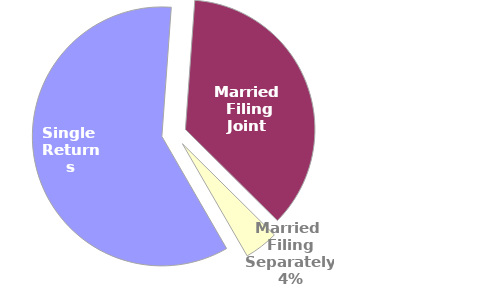
| Category | Series 0 |
|---|---|
| Single 
Returns | 2477756 |
| Married 
Filing Joint  | 1510685 |
| Married 
Filing Separately  | 176499 |